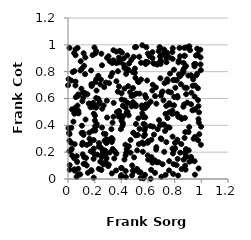
| Category | Series 0 |
|---|---|
| 0.03563302966450452 | 0.797 |
| 0.15725470546570997 | 0.562 |
| 0.30591438788167596 | 0.107 |
| 0.44442905802895954 | 0.921 |
| 0.5340514019186466 | 0.911 |
| 0.07893503927534722 | 0.489 |
| 0.6254720741834504 | 0.292 |
| 0.9351083508665092 | 0.695 |
| 0.5096278023998341 | 0.543 |
| 0.7646215727333777 | 0.555 |
| 0.44600414170575103 | 0.501 |
| 0.7216394145949058 | 0.202 |
| 0.8320018416825582 | 0.78 |
| 0.32900688421911745 | 0.042 |
| 0.709395573126925 | 0.652 |
| 0.2827878612417799 | 0.186 |
| 0.5443690685158465 | 0.05 |
| 0.6652407143829242 | 0.125 |
| 0.4169189847666831 | 0.852 |
| 0.5574837324675022 | 0.272 |
| 0.40282279622567524 | 0.081 |
| 0.6108446168091833 | 0.916 |
| 0.8815692867406937 | 0.184 |
| 0.012519489059148002 | 0.07 |
| 0.10437489069999399 | 0.823 |
| 0.7888248850764427 | 0.038 |
| 0.5953873154129009 | 0.272 |
| 0.1165228921376896 | 0.329 |
| 0.0777591043655525 | 0.507 |
| 0.49057272217372655 | 0.345 |
| 0.5478502889428372 | 0.866 |
| 0.19061189964677616 | 0.551 |
| 0.9052758802610906 | 0.213 |
| 0.07208225706951615 | 0.977 |
| 0.5364906254664229 | 0.374 |
| 0.34676503743022435 | 0.153 |
| 0.34072524804923493 | 0.96 |
| 0.4935841741137938 | 0.911 |
| 0.6264411466432885 | 0.163 |
| 0.07679006643516732 | 0.63 |
| 0.05717907458786809 | 0.923 |
| 0.700557759395515 | 0.017 |
| 0.5834725574929299 | 0.873 |
| 0.07466112687250843 | 0.033 |
| 0.7198555151066441 | 0.405 |
| 0.8417674934536472 | 0.196 |
| 0.04613624099264977 | 0.939 |
| 0.1455468854350774 | 0.631 |
| 0.853430407727154 | 0.448 |
| 0.6325949767257182 | 0.659 |
| 0.20612186753274078 | 0.722 |
| 0.881762902901905 | 0.202 |
| 0.06862611128302931 | 0.127 |
| 0.8667332366656515 | 0.144 |
| 0.5444251770319276 | 0.008 |
| 0.7838020714236587 | 0.227 |
| 0.5240308898563995 | 0.328 |
| 0.8744443689488591 | 0.681 |
| 0.05657004191745656 | 0.966 |
| 0.6447943794131817 | 0.331 |
| 0.2715642921101478 | 0.685 |
| 0.3453617172842169 | 0.881 |
| 0.9234217345973891 | 0.161 |
| 0.2285788836759919 | 0.597 |
| 0.20183481233485892 | 0.436 |
| 0.12916570348441983 | 0.639 |
| 0.8670602330831357 | 0.865 |
| 0.37488271229091713 | 0.803 |
| 0.18407499231285784 | 0.923 |
| 0.20259699793496067 | 0.472 |
| 0.5113440360093787 | 0.637 |
| 0.695132469357539 | 0.303 |
| 0.18132555514791554 | 0.703 |
| 0.24702895944130027 | 0.741 |
| 0.40399143325103937 | 0.45 |
| 0.046087987345045656 | 0.155 |
| 0.506792610633061 | 0.555 |
| 0.9825010202327943 | 0.497 |
| 0.8259075600507771 | 0.026 |
| 0.652661549607466 | 0.046 |
| 0.516196099518228 | 0.074 |
| 0.8726493535969565 | 0.918 |
| 0.8147084099534795 | 0.103 |
| 0.6014727990503329 | 0.145 |
| 0.49056151615090515 | 0.343 |
| 0.19343805210877565 | 0.226 |
| 0.3799780550042329 | 0.869 |
| 0.9100119515219347 | 0.129 |
| 0.27907445741111997 | 0.212 |
| 0.8308764308485884 | 0.882 |
| 0.19651179912720457 | 0.188 |
| 0.8203457588522839 | 0.619 |
| 0.9384938945323787 | 0.743 |
| 0.1983085175587379 | 0.98 |
| 0.9420459151622673 | 0.3 |
| 0.948632118701561 | 0.839 |
| 0.02903005044382853 | 0.519 |
| 0.923114341552792 | 0.557 |
| 0.7459756437684457 | 0.455 |
| 0.4777339687497904 | 0.541 |
| 0.43054982523759133 | 0.255 |
| 0.43170767440450586 | 0.532 |
| 0.2554476945530713 | 0.183 |
| 0.4024363384870739 | 0.593 |
| 0.6966495696412025 | 0.622 |
| 0.1613771927019352 | 0.3 |
| 0.21165359271136697 | 0.953 |
| 0.3963635155993166 | 0.371 |
| 0.46941298226638856 | 0.291 |
| 0.8820308309478597 | 0.07 |
| 0.7824669315075276 | 0.485 |
| 0.44014120768382853 | 0.495 |
| 0.25041341025791447 | 0.934 |
| 0.5015383314833852 | 0.823 |
| 0.7653703418222585 | 0.786 |
| 0.20358605201255797 | 0.393 |
| 0.3630327553735267 | 0.189 |
| 0.8152538842195785 | 0.735 |
| 0.17556850507719263 | 0.061 |
| 0.4328513422570683 | 0.059 |
| 0.010266241414984313 | 0.208 |
| 0.7216116522842217 | 0.964 |
| 0.9221885897266981 | 0.164 |
| 0.5793351780751608 | 0.381 |
| 0.31307573939561534 | 0.878 |
| 0.2138391260776985 | 0.659 |
| 0.3735617436172606 | 0.651 |
| 0.011008889289695527 | 0.977 |
| 0.8846860983848713 | 0.223 |
| 0.2807629415855507 | 0.335 |
| 0.9844252891726221 | 0.334 |
| 0.7968187977232787 | 0.611 |
| 0.43157071224319604 | 0.175 |
| 0.20532045447148634 | 0.936 |
| 0.8225814183010978 | 0.15 |
| 0.7384080433089355 | 0.87 |
| 0.6728793603267023 | 0.371 |
| 0.21057979706823254 | 0.532 |
| 0.5780158165397067 | 0.529 |
| 0.5922188670633197 | 0.543 |
| 0.9788437487020605 | 0.446 |
| 0.5858339328218688 | 0.606 |
| 0.36703647269313144 | 0.499 |
| 0.23711753986353387 | 0.576 |
| 0.569033431424668 | 0.319 |
| 0.040454871515054766 | 0.427 |
| 0.974338953810855 | 0.677 |
| 0.456478630369994 | 0.244 |
| 0.24212569490626637 | 0.129 |
| 0.26909047843936196 | 0.338 |
| 0.7474323135710214 | 0.386 |
| 0.14136893046923868 | 0.254 |
| 0.9495105727749563 | 0.133 |
| 0.5275154171254685 | 0.452 |
| 0.44006459427832584 | 0.221 |
| 0.8386461248547867 | 0.765 |
| 0.6629088393247221 | 0.561 |
| 0.4957352171128078 | 0.161 |
| 0.4938256890846566 | 0.625 |
| 0.38227632549541446 | 0.905 |
| 0.049520682179997846 | 0.062 |
| 0.11745239315813702 | 0.937 |
| 0.7613593107569053 | 0.383 |
| 0.7459999700498012 | 0.725 |
| 0.8854379822208005 | 0.165 |
| 0.2542735645275871 | 0.225 |
| 0.04788185699979842 | 0.492 |
| 0.598978069813513 | 0.87 |
| 0.9795716258534691 | 0.079 |
| 0.2929157352323847 | 0.903 |
| 0.6900919024135728 | 0.876 |
| 0.10059475263461078 | 0.673 |
| 0.26254674912036746 | 0.205 |
| 0.7315642364723096 | 0.031 |
| 0.5481818017063093 | 0.741 |
| 0.5938202570976902 | 0.734 |
| 0.02793645959232622 | 0.224 |
| 0.36150511948355074 | 0.864 |
| 0.48732592023902943 | 0.573 |
| 0.5757007799252084 | 0.406 |
| 0.2676635024097591 | 0.548 |
| 0.12086776030227603 | 0.843 |
| 0.8782469905607037 | 0.099 |
| 0.8405641931578546 | 0.915 |
| 0.7950499140761986 | 0.814 |
| 0.7278126319315674 | 0.358 |
| 0.17115419369886564 | 0.206 |
| 0.022932409541389347 | 0.27 |
| 0.9694812066911285 | 0.785 |
| 0.5367169282239092 | 0.636 |
| 0.17507905280692734 | 0.066 |
| 0.3131967644961714 | 0.294 |
| 0.5669103606655168 | 0.41 |
| 0.1928892950751433 | 0.01 |
| 0.879530991236594 | 0.35 |
| 0.8271180111415063 | 0.463 |
| 0.2882903429011712 | 0.267 |
| 0.4745602771057324 | 0.888 |
| 0.7849345924758124 | 0.895 |
| 0.5025547744859902 | 0.982 |
| 0.6021950732527096 | 0.558 |
| 0.3014052505391087 | 0.096 |
| 0.4358913917001129 | 0.783 |
| 0.507910574968093 | 0.325 |
| 0.3969783337334159 | 0.017 |
| 0.2646050397892574 | 0.108 |
| 0.0005574729176645356 | 0.699 |
| 0.313532790448222 | 0.198 |
| 0.6694866761948005 | 0.853 |
| 0.342883475329843 | 0.567 |
| 0.8519406687588789 | 0.074 |
| 0.5303410280447448 | 0.723 |
| 0.5572700705394731 | 0.49 |
| 0.7009646558975562 | 0.297 |
| 0.44796516853020724 | 0.568 |
| 0.42274635812048394 | 0.827 |
| 0.012529329909304998 | 0.104 |
| 0.0245749698531523 | 0.734 |
| 0.602326077256067 | 0.282 |
| 0.6512072730822507 | 0.138 |
| 0.6233127587818089 | 0.068 |
| 0.37947488451029465 | 0.466 |
| 0.41179851804807915 | 0.416 |
| 0.003611323676144655 | 0.378 |
| 0.17317977715319022 | 0.809 |
| 0.5099137580260154 | 0.984 |
| 0.15988606194727195 | 0.345 |
| 0.211175598901983 | 0.604 |
| 0.1281676497530065 | 0.781 |
| 0.7376308685766668 | 0.275 |
| 0.7720333134261967 | 0.645 |
| 0.6195118935137789 | 0.002 |
| 0.048982232315203385 | 0.486 |
| 0.32102537646652235 | 0.766 |
| 0.2562054198628006 | 0.524 |
| 0.4551969705650018 | 0.475 |
| 0.7093359182497552 | 0.11 |
| 0.75792692565497 | 0.064 |
| 0.7365395766182852 | 0.905 |
| 0.7159463593079847 | 0.932 |
| 0.51873906147359 | 0.213 |
| 0.42366907079564203 | 0.674 |
| 0.5673319027242409 | 0.262 |
| 0.18889241934662354 | 0.567 |
| 0.2197120930957334 | 0.181 |
| 0.128715253506514 | 0.112 |
| 0.690650452279434 | 0.401 |
| 0.2314413330652895 | 0.241 |
| 0.09195891316836974 | 0.034 |
| 0.5984238046564304 | 0.176 |
| 0.694457885708973 | 0.858 |
| 0.2408471491853137 | 0.24 |
| 0.11260882861839408 | 0.643 |
| 0.8436016047949935 | 0.46 |
| 0.6985252735834838 | 0.88 |
| 0.80243701097228 | 0.269 |
| 0.5797758974919436 | 0.459 |
| 0.9562078556034115 | 0.857 |
| 0.9223339599110065 | 0.773 |
| 0.7604258070665407 | 0.565 |
| 0.8284535498763268 | 0.869 |
| 0.6867192214500074 | 0.983 |
| 0.7529465901011347 | 0.651 |
| 0.33455310354635626 | 0.296 |
| 0.5314072960723647 | 0.26 |
| 0.10789472090017038 | 0.58 |
| 0.293630596018723 | 0.458 |
| 0.02518692620950425 | 0.381 |
| 0.951848482008087 | 0.52 |
| 0.25505948593582295 | 0.848 |
| 0.9747641722720838 | 0.588 |
| 0.0557906952787155 | 0.697 |
| 0.711023790113029 | 0.407 |
| 0.04793591548597913 | 0.804 |
| 0.8900216219620398 | 0.981 |
| 0.25499612887224316 | 0.384 |
| 0.15642243299990227 | 0.561 |
| 0.33921064785245064 | 0.884 |
| 0.6329181984823714 | 0.945 |
| 0.33126710947712823 | 0.864 |
| 0.23109765785387412 | 0.076 |
| 0.8498076276016545 | 0.26 |
| 0.5059089369762515 | 0.754 |
| 0.8624726256687688 | 0.809 |
| 0.4013359382570367 | 0.433 |
| 0.13162641318208185 | 0.443 |
| 0.6182379878813861 | 0.395 |
| 0.4764774288556958 | 0.618 |
| 0.05052740854410845 | 0.26 |
| 0.9750081381616671 | 0.29 |
| 0.5187729486442696 | 0.073 |
| 0.4933816770562184 | 0.058 |
| 0.760512002606415 | 0.907 |
| 0.2141794405450376 | 0.396 |
| 0.5314142843297285 | 0.052 |
| 0.6198059575564631 | 0.576 |
| 0.653344253120859 | 0.618 |
| 0.5664838800685154 | 0.005 |
| 0.5873613995009107 | 0.983 |
| 0.1350972405354689 | 0.157 |
| 0.736805000963697 | 0.545 |
| 0.5013211644831052 | 0.79 |
| 0.3272702271633906 | 0.305 |
| 0.8697720512573691 | 0.555 |
| 0.48040063664341437 | 0.027 |
| 0.17538542395401033 | 0.707 |
| 0.3039389120748949 | 0.915 |
| 0.7830865406310932 | 0.946 |
| 0.6337103809996529 | 0.901 |
| 0.993908060345206 | 0.907 |
| 0.05163631632914163 | 0.529 |
| 0.5740055816568224 | 0.363 |
| 0.42490728968316016 | 0.587 |
| 0.4091902081889267 | 0.397 |
| 0.43420789183573444 | 0.015 |
| 0.5775258174955324 | 0.03 |
| 0.19342545939076447 | 0.487 |
| 0.3629497424795316 | 0.728 |
| 0.959554842559549 | 0.92 |
| 0.8744027072092061 | 0.306 |
| 0.25067901260069686 | 0.067 |
| 0.05683946911173523 | 0.726 |
| 0.8217925767364603 | 0.608 |
| 0.4855958588978033 | 0.062 |
| 0.14027993346530274 | 0.101 |
| 0.2427795825093962 | 0.705 |
| 0.07655118207465719 | 0.077 |
| 0.6447244011553399 | 0.859 |
| 0.5786906137587574 | 0.625 |
| 0.6592831777167175 | 0.682 |
| 0.4342654209563518 | 0.826 |
| 0.9922312821111346 | 0.963 |
| 0.9277749944670275 | 0.137 |
| 0.4231945154855341 | 0.145 |
| 0.01086705372507351 | 0.286 |
| 0.9513267593406427 | 0.313 |
| 0.38275620015818584 | 0.69 |
| 0.6797627918332869 | 0.954 |
| 0.9724298477668297 | 0.93 |
| 0.10433711230629453 | 0.397 |
| 0.0748666413072164 | 0.619 |
| 0.16410124581590813 | 0.265 |
| 0.3606279211977672 | 0.063 |
| 0.48682916046004615 | 0.796 |
| 0.8037300707078101 | 0.23 |
| 0.7439009660855376 | 0.743 |
| 0.3904900566429923 | 0.876 |
| 0.5625858119689862 | 0.462 |
| 0.946579590666628 | 0.856 |
| 0.7874268681181444 | 0.19 |
| 0.6792330957768924 | 0.125 |
| 0.18503096642113592 | 0.36 |
| 0.9808727107591058 | 0.421 |
| 0.32845741310752624 | 0.275 |
| 0.7953689488854828 | 0.549 |
| 0.7313190142640936 | 0.486 |
| 0.7936542421111711 | 0.216 |
| 0.7237428150495168 | 0.714 |
| 0.007584717321694896 | 0.343 |
| 0.4366114385954635 | 0.194 |
| 0.8769785914278284 | 0.455 |
| 0.6912296006285414 | 0.978 |
| 0.7039255273517013 | 0.646 |
| 0.9519490435236196 | 0.032 |
| 0.48733910987513346 | 0.678 |
| 0.5830640754805679 | 0.857 |
| 0.06522409125087772 | 0.17 |
| 0.05891495219034428 | 0.61 |
| 0.9037024288878586 | 0.35 |
| 0.7592603970731653 | 0.497 |
| 0.8049713732043522 | 0.68 |
| 0.5569273766421193 | 0.997 |
| 0.9089840911533312 | 0.387 |
| 0.28877277461813117 | 0.297 |
| 0.5249818244414187 | 0.726 |
| 0.19204042486231032 | 0.15 |
| 0.18792496951301238 | 0.538 |
| 0.7859463342809258 | 0.975 |
| 0.22704405631666255 | 0.769 |
| 0.0116680905359288 | 0.335 |
| 0.6932412210827171 | 0.917 |
| 0.41420133352761423 | 0.468 |
| 0.10946577729115292 | 0.27 |
| 0.21096971327528388 | 0.742 |
| 0.996487624812944 | 0.255 |
| 0.8946709214049935 | 0.57 |
| 0.9025720755159009 | 0.771 |
| 0.6613435397877716 | 0.219 |
| 0.12971264117875198 | 0.906 |
| 0.8361975833811653 | 0.977 |
| 0.8451576792464932 | 0.774 |
| 0.3352131843278119 | 0.224 |
| 0.6625032496590543 | 0.238 |
| 0.599491164879783 | 0.935 |
| 0.4660603423222704 | 0.646 |
| 0.2915982257335214 | 0.584 |
| 0.4515146889561177 | 0.692 |
| 0.48136392587981724 | 0.101 |
| 0.020085167966461055 | 0.213 |
| 0.8172231142759561 | 0.486 |
| 0.2850305880861073 | 0.719 |
| 0.4043866458823481 | 0.942 |
| 0.784346113505831 | 0.316 |
| 0.8731682782325872 | 0.978 |
| 0.3851934162484314 | 0.484 |
| 0.5529397167340958 | 0.548 |
| 0.9330599009858545 | 0.512 |
| 0.6357515468751586 | 0.702 |
| 0.7826473626687894 | 0.51 |
| 0.0044690605382460774 | 0.745 |
| 0.1207060477242378 | 0.162 |
| 0.6930788836665565 | 0.75 |
| 0.2969562752617016 | 0.283 |
| 0.27370327637094827 | 0.285 |
| 0.8653336044353431 | 0.539 |
| 0.9964753408185877 | 0.811 |
| 0.2153561302551363 | 0.411 |
| 0.9497723236907527 | 0.614 |
| 0.6914853348807706 | 0.912 |
| 0.41836379576152954 | 0.899 |
| 0.4425550789377365 | 0.806 |
| 0.06494032317075081 | 0.016 |
| 0.12282620969115982 | 0.639 |
| 0.5571712458515781 | 0.527 |
| 0.11209407800486872 | 0.344 |
| 0.10996349321437712 | 0.184 |
| 0.6207159801741702 | 0.153 |
| 0.23237988545417773 | 0.56 |
| 0.45802438684461444 | 0.861 |
| 0.454273555592939 | 0.814 |
| 0.11471077224702414 | 0.607 |
| 0.3511081279977127 | 0.206 |
| 0.8851303554977431 | 0.841 |
| 0.1930128685593802 | 0.29 |
| 0.8071347555982133 | 0.738 |
| 0.32562476280472585 | 0.371 |
| 0.8664629832888565 | 0.797 |
| 0.8198312944952835 | 0.292 |
| 0.10206029775569704 | 0.343 |
| 0.9982319626118169 | 0.39 |
| 0.09554324575798391 | 0.878 |
| 0.33331839076790826 | 0.79 |
| 0.9616294371567543 | 0.772 |
| 0.978444188337748 | 0.543 |
| 0.1493160588495514 | 0.046 |
| 0.8469003443288069 | 0.706 |
| 0.994249274136531 | 0.854 |
| 0.10619791453866156 | 0.255 |
| 0.8172893917611077 | 0.28 |
| 0.39921409726414875 | 0.083 |
| 0.46908411457433297 | 0.196 |
| 0.1689619579568536 | 0.535 |
| 0.04756132354658315 | 0.072 |
| 0.07127633886611802 | 0.547 |
| 0.7446247070676865 | 0.941 |
| 0.2046603228727309 | 0.361 |
| 0.8697422869491769 | 0.822 |
| 0.38292021036468565 | 0.507 |
| 0.5622327210181942 | 0.474 |
| 0.7889932361414783 | 0.738 |
| 0.8761381477012877 | 0.918 |
| 0.6332193884908315 | 0.122 |
| 0.7587608758511319 | 0.133 |
| 0.23199054675420633 | 0.268 |
| 0.1171376210673989 | 0.113 |
| 0.5770900590585127 | 0.331 |
| 0.9689155489687573 | 0.971 |
| 0.40163583354537924 | 0.639 |
| 0.890681307694469 | 0.679 |
| 0.2544782081637083 | 0.163 |
| 0.28915161482548163 | 0.154 |
| 0.34123891969535974 | 0.464 |
| 0.41152673524219324 | 0.546 |
| 0.9100259312667041 | 0.989 |
| 0.17728498901798603 | 0.692 |
| 0.30849792822954397 | 0.714 |
| 0.7924495351965801 | 0.11 |
| 0.8859930711200099 | 0.632 |
| 0.5097429639025974 | 0.41 |
| 0.09325274618908413 | 0.809 |
| 0.03117565710810131 | 0.175 |
| 0.5611259777638714 | 0.203 |
| 0.9499102138435954 | 0.517 |
| 0.2813078095981095 | 0.119 |
| 0.9529682562104622 | 0.696 |
| 0.925386894094774 | 0.643 |
| 0.8540930413241055 | 0.783 |
| 0.7162909750622759 | 0.586 |
| 0.6376503760180774 | 0.39 |
| 0.5846231153621883 | 0.556 |
| 0.6652291644097992 | 0.857 |
| 0.6827189541276671 | 0.439 |
| 0.6410274290690012 | 0.863 |
| 0.28266889472750867 | 0.127 |
| 0.5986921831132677 | 0.271 |
| 0.3893049764838083 | 0.955 |
| 0.33428067900828884 | 0.421 |
| 0.3629972393716073 | 0.949 |
| 0.915005927565655 | 0.961 |
| 0.39927718558609027 | 0.029 |